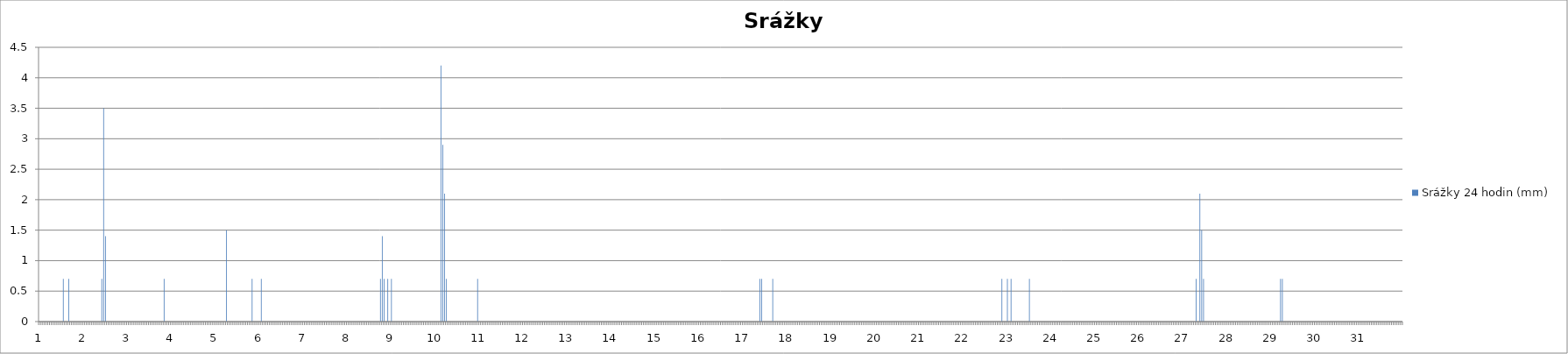
| Category | Srážky 24 hodin (mm) |
|---|---|
| 0 | 0 |
| 1 | 0 |
| 2 | 0 |
| 3 | 0 |
| 4 | 0 |
| 5 | 0 |
| 6 | 0 |
| 7 | 0 |
| 8 | 0 |
| 9 | 0 |
| 10 | 0 |
| 11 | 0 |
| 12 | 0 |
| 13 | 0.7 |
| 14 | 0 |
| 15 | 0 |
| 16 | 0.7 |
| 17 | 0 |
| 18 | 0 |
| 19 | 0 |
| 20 | 0 |
| 21 | 0 |
| 22 | 0 |
| 23 | 0 |
| 24 | 0 |
| 25 | 0 |
| 26 | 0 |
| 27 | 0 |
| 28 | 0 |
| 29 | 0 |
| 30 | 0 |
| 31 | 0 |
| 32 | 0 |
| 33 | 0 |
| 34 | 0.7 |
| 35 | 3.5 |
| 36 | 1.4 |
| 37 | 0 |
| 38 | 0 |
| 39 | 0 |
| 40 | 0 |
| 41 | 0 |
| 42 | 0 |
| 43 | 0 |
| 44 | 0 |
| 45 | 0 |
| 46 | 0 |
| 47 | 0 |
| 48 | 0 |
| 49 | 0 |
| 50 | 0 |
| 51 | 0 |
| 52 | 0 |
| 53 | 0 |
| 54 | 0 |
| 55 | 0 |
| 56 | 0 |
| 57 | 0 |
| 58 | 0 |
| 59 | 0 |
| 60 | 0 |
| 61 | 0 |
| 62 | 0 |
| 63 | 0 |
| 64 | 0 |
| 65 | 0 |
| 66 | 0 |
| 67 | 0 |
| 68 | 0.7 |
| 69 | 0 |
| 70 | 0 |
| 71 | 0 |
| 72 | 0 |
| 73 | 0 |
| 74 | 0 |
| 75 | 0 |
| 76 | 0 |
| 77 | 0 |
| 78 | 0 |
| 79 | 0 |
| 80 | 0 |
| 81 | 0 |
| 82 | 0 |
| 83 | 0 |
| 84 | 0 |
| 85 | 0 |
| 86 | 0 |
| 87 | 0 |
| 88 | 0 |
| 89 | 0 |
| 90 | 0 |
| 91 | 0 |
| 92 | 0 |
| 93 | 0 |
| 94 | 0 |
| 95 | 0 |
| 96 | 0 |
| 97 | 0 |
| 98 | 0 |
| 99 | 0 |
| 100 | 0 |
| 101 | 0 |
| 102 | 1.5 |
| 103 | 0 |
| 104 | 0 |
| 105 | 0 |
| 106 | 0 |
| 107 | 0 |
| 108 | 0 |
| 109 | 0 |
| 110 | 0 |
| 111 | 0 |
| 112 | 0 |
| 113 | 0 |
| 114 | 0 |
| 115 | 0 |
| 116 | 0.7 |
| 117 | 0 |
| 118 | 0 |
| 119 | 0 |
| 120 | 0 |
| 121 | 0.7 |
| 122 | 0 |
| 123 | 0 |
| 124 | 0 |
| 125 | 0 |
| 126 | 0 |
| 127 | 0 |
| 128 | 0 |
| 129 | 0 |
| 130 | 0 |
| 131 | 0 |
| 132 | 0 |
| 133 | 0 |
| 134 | 0 |
| 135 | 0 |
| 136 | 0 |
| 137 | 0 |
| 138 | 0 |
| 139 | 0 |
| 140 | 0 |
| 141 | 0 |
| 142 | 0 |
| 143 | 0 |
| 144 | 0 |
| 145 | 0 |
| 146 | 0 |
| 147 | 0 |
| 148 | 0 |
| 149 | 0 |
| 150 | 0 |
| 151 | 0 |
| 152 | 0 |
| 153 | 0 |
| 154 | 0 |
| 155 | 0 |
| 156 | 0 |
| 157 | 0 |
| 158 | 0 |
| 159 | 0 |
| 160 | 0 |
| 161 | 0 |
| 162 | 0 |
| 163 | 0 |
| 164 | 0 |
| 165 | 0 |
| 166 | 0 |
| 167 | 0 |
| 168 | 0 |
| 169 | 0 |
| 170 | 0 |
| 171 | 0 |
| 172 | 0 |
| 173 | 0 |
| 174 | 0 |
| 175 | 0 |
| 176 | 0 |
| 177 | 0 |
| 178 | 0 |
| 179 | 0 |
| 180 | 0 |
| 181 | 0 |
| 182 | 0 |
| 183 | 0 |
| 184 | 0 |
| 185 | 0 |
| 186 | 0.7 |
| 187 | 1.4 |
| 188 | 0.7 |
| 189 | 0 |
| 190 | 0.7 |
| 191 | 0 |
| 192 | 0.7 |
| 193 | 0 |
| 194 | 0 |
| 195 | 0 |
| 196 | 0 |
| 197 | 0 |
| 198 | 0 |
| 199 | 0 |
| 200 | 0 |
| 201 | 0 |
| 202 | 0 |
| 203 | 0 |
| 204 | 0 |
| 205 | 0 |
| 206 | 0 |
| 207 | 0 |
| 208 | 0 |
| 209 | 0 |
| 210 | 0 |
| 211 | 0 |
| 212 | 0 |
| 213 | 0 |
| 214 | 0 |
| 215 | 0 |
| 216 | 0 |
| 217 | 0 |
| 218 | 0 |
| 219 | 4.2 |
| 220 | 2.9 |
| 221 | 2.1 |
| 222 | 0.7 |
| 223 | 0 |
| 224 | 0 |
| 225 | 0 |
| 226 | 0 |
| 227 | 0 |
| 228 | 0 |
| 229 | 0 |
| 230 | 0 |
| 231 | 0 |
| 232 | 0 |
| 233 | 0 |
| 234 | 0 |
| 235 | 0 |
| 236 | 0 |
| 237 | 0 |
| 238 | 0 |
| 239 | 0.7 |
| 240 | 0 |
| 241 | 0 |
| 242 | 0 |
| 243 | 0 |
| 244 | 0 |
| 245 | 0 |
| 246 | 0 |
| 247 | 0 |
| 248 | 0 |
| 249 | 0 |
| 250 | 0 |
| 251 | 0 |
| 252 | 0 |
| 253 | 0 |
| 254 | 0 |
| 255 | 0 |
| 256 | 0 |
| 257 | 0 |
| 258 | 0 |
| 259 | 0 |
| 260 | 0 |
| 261 | 0 |
| 262 | 0 |
| 263 | 0 |
| 264 | 0 |
| 265 | 0 |
| 266 | 0 |
| 267 | 0 |
| 268 | 0 |
| 269 | 0 |
| 270 | 0 |
| 271 | 0 |
| 272 | 0 |
| 273 | 0 |
| 274 | 0 |
| 275 | 0 |
| 276 | 0 |
| 277 | 0 |
| 278 | 0 |
| 279 | 0 |
| 280 | 0 |
| 281 | 0 |
| 282 | 0 |
| 283 | 0 |
| 284 | 0 |
| 285 | 0 |
| 286 | 0 |
| 287 | 0 |
| 288 | 0 |
| 289 | 0 |
| 290 | 0 |
| 291 | 0 |
| 292 | 0 |
| 293 | 0 |
| 294 | 0 |
| 295 | 0 |
| 296 | 0 |
| 297 | 0 |
| 298 | 0 |
| 299 | 0 |
| 300 | 0 |
| 301 | 0 |
| 302 | 0 |
| 303 | 0 |
| 304 | 0 |
| 305 | 0 |
| 306 | 0 |
| 307 | 0 |
| 308 | 0 |
| 309 | 0 |
| 310 | 0 |
| 311 | 0 |
| 312 | 0 |
| 313 | 0 |
| 314 | 0 |
| 315 | 0 |
| 316 | 0 |
| 317 | 0 |
| 318 | 0 |
| 319 | 0 |
| 320 | 0 |
| 321 | 0 |
| 322 | 0 |
| 323 | 0 |
| 324 | 0 |
| 325 | 0 |
| 326 | 0 |
| 327 | 0 |
| 328 | 0 |
| 329 | 0 |
| 330 | 0 |
| 331 | 0 |
| 332 | 0 |
| 333 | 0 |
| 334 | 0 |
| 335 | 0 |
| 336 | 0 |
| 337 | 0 |
| 338 | 0 |
| 339 | 0 |
| 340 | 0 |
| 341 | 0 |
| 342 | 0 |
| 343 | 0 |
| 344 | 0 |
| 345 | 0 |
| 346 | 0 |
| 347 | 0 |
| 348 | 0 |
| 349 | 0 |
| 350 | 0 |
| 351 | 0 |
| 352 | 0 |
| 353 | 0 |
| 354 | 0 |
| 355 | 0 |
| 356 | 0 |
| 357 | 0 |
| 358 | 0 |
| 359 | 0 |
| 360 | 0 |
| 361 | 0 |
| 362 | 0 |
| 363 | 0 |
| 364 | 0 |
| 365 | 0 |
| 366 | 0 |
| 367 | 0 |
| 368 | 0 |
| 369 | 0 |
| 370 | 0 |
| 371 | 0 |
| 372 | 0 |
| 373 | 0 |
| 374 | 0 |
| 375 | 0 |
| 376 | 0 |
| 377 | 0 |
| 378 | 0 |
| 379 | 0 |
| 380 | 0 |
| 381 | 0 |
| 382 | 0 |
| 383 | 0 |
| 384 | 0 |
| 385 | 0 |
| 386 | 0 |
| 387 | 0 |
| 388 | 0 |
| 389 | 0 |
| 390 | 0 |
| 391 | 0 |
| 392 | 0 |
| 393 | 0.7 |
| 394 | 0.7 |
| 395 | 0 |
| 396 | 0 |
| 397 | 0 |
| 398 | 0 |
| 399 | 0 |
| 400 | 0.7 |
| 401 | 0 |
| 402 | 0 |
| 403 | 0 |
| 404 | 0 |
| 405 | 0 |
| 406 | 0 |
| 407 | 0 |
| 408 | 0 |
| 409 | 0 |
| 410 | 0 |
| 411 | 0 |
| 412 | 0 |
| 413 | 0 |
| 414 | 0 |
| 415 | 0 |
| 416 | 0 |
| 417 | 0 |
| 418 | 0 |
| 419 | 0 |
| 420 | 0 |
| 421 | 0 |
| 422 | 0 |
| 423 | 0 |
| 424 | 0 |
| 425 | 0 |
| 426 | 0 |
| 427 | 0 |
| 428 | 0 |
| 429 | 0 |
| 430 | 0 |
| 431 | 0 |
| 432 | 0 |
| 433 | 0 |
| 434 | 0 |
| 435 | 0 |
| 436 | 0 |
| 437 | 0 |
| 438 | 0 |
| 439 | 0 |
| 440 | 0 |
| 441 | 0 |
| 442 | 0 |
| 443 | 0 |
| 444 | 0 |
| 445 | 0 |
| 446 | 0 |
| 447 | 0 |
| 448 | 0 |
| 449 | 0 |
| 450 | 0 |
| 451 | 0 |
| 452 | 0 |
| 453 | 0 |
| 454 | 0 |
| 455 | 0 |
| 456 | 0 |
| 457 | 0 |
| 458 | 0 |
| 459 | 0 |
| 460 | 0 |
| 461 | 0 |
| 462 | 0 |
| 463 | 0 |
| 464 | 0 |
| 465 | 0 |
| 466 | 0 |
| 467 | 0 |
| 468 | 0 |
| 469 | 0 |
| 470 | 0 |
| 471 | 0 |
| 472 | 0 |
| 473 | 0 |
| 474 | 0 |
| 475 | 0 |
| 476 | 0 |
| 477 | 0 |
| 478 | 0 |
| 479 | 0 |
| 480 | 0 |
| 481 | 0 |
| 482 | 0 |
| 483 | 0 |
| 484 | 0 |
| 485 | 0 |
| 486 | 0 |
| 487 | 0 |
| 488 | 0 |
| 489 | 0 |
| 490 | 0 |
| 491 | 0 |
| 492 | 0 |
| 493 | 0 |
| 494 | 0 |
| 495 | 0 |
| 496 | 0 |
| 497 | 0 |
| 498 | 0 |
| 499 | 0 |
| 500 | 0 |
| 501 | 0 |
| 502 | 0 |
| 503 | 0 |
| 504 | 0 |
| 505 | 0 |
| 506 | 0 |
| 507 | 0 |
| 508 | 0 |
| 509 | 0 |
| 510 | 0 |
| 511 | 0 |
| 512 | 0 |
| 513 | 0 |
| 514 | 0 |
| 515 | 0 |
| 516 | 0 |
| 517 | 0 |
| 518 | 0 |
| 519 | 0 |
| 520 | 0 |
| 521 | 0 |
| 522 | 0 |
| 523 | 0 |
| 524 | 0 |
| 525 | 0.7 |
| 526 | 0 |
| 527 | 0 |
| 528 | 0.7 |
| 529 | 0 |
| 530 | 0.7 |
| 531 | 0 |
| 532 | 0 |
| 533 | 0 |
| 534 | 0 |
| 535 | 0 |
| 536 | 0 |
| 537 | 0 |
| 538 | 0 |
| 539 | 0 |
| 540 | 0.7 |
| 541 | 0 |
| 542 | 0 |
| 543 | 0 |
| 544 | 0 |
| 545 | 0 |
| 546 | 0 |
| 547 | 0 |
| 548 | 0 |
| 549 | 0 |
| 550 | 0 |
| 551 | 0 |
| 552 | 0 |
| 553 | 0 |
| 554 | 0 |
| 555 | 0 |
| 556 | 0 |
| 557 | 0 |
| 558 | 0 |
| 559 | 0 |
| 560 | 0 |
| 561 | 0 |
| 562 | 0 |
| 563 | 0 |
| 564 | 0 |
| 565 | 0 |
| 566 | 0 |
| 567 | 0 |
| 568 | 0 |
| 569 | 0 |
| 570 | 0 |
| 571 | 0 |
| 572 | 0 |
| 573 | 0 |
| 574 | 0 |
| 575 | 0 |
| 576 | 0 |
| 577 | 0 |
| 578 | 0 |
| 579 | 0 |
| 580 | 0 |
| 581 | 0 |
| 582 | 0 |
| 583 | 0 |
| 584 | 0 |
| 585 | 0 |
| 586 | 0 |
| 587 | 0 |
| 588 | 0 |
| 589 | 0 |
| 590 | 0 |
| 591 | 0 |
| 592 | 0 |
| 593 | 0 |
| 594 | 0 |
| 595 | 0 |
| 596 | 0 |
| 597 | 0 |
| 598 | 0 |
| 599 | 0 |
| 600 | 0 |
| 601 | 0 |
| 602 | 0 |
| 603 | 0 |
| 604 | 0 |
| 605 | 0 |
| 606 | 0 |
| 607 | 0 |
| 608 | 0 |
| 609 | 0 |
| 610 | 0 |
| 611 | 0 |
| 612 | 0 |
| 613 | 0 |
| 614 | 0 |
| 615 | 0 |
| 616 | 0 |
| 617 | 0 |
| 618 | 0 |
| 619 | 0 |
| 620 | 0 |
| 621 | 0 |
| 622 | 0 |
| 623 | 0 |
| 624 | 0 |
| 625 | 0 |
| 626 | 0 |
| 627 | 0 |
| 628 | 0 |
| 629 | 0 |
| 630 | 0 |
| 631 | 0.7 |
| 632 | 0 |
| 633 | 2.1 |
| 634 | 1.5 |
| 635 | 0.7 |
| 636 | 0 |
| 637 | 0 |
| 638 | 0 |
| 639 | 0 |
| 640 | 0 |
| 641 | 0 |
| 642 | 0 |
| 643 | 0 |
| 644 | 0 |
| 645 | 0 |
| 646 | 0 |
| 647 | 0 |
| 648 | 0 |
| 649 | 0 |
| 650 | 0 |
| 651 | 0 |
| 652 | 0 |
| 653 | 0 |
| 654 | 0 |
| 655 | 0 |
| 656 | 0 |
| 657 | 0 |
| 658 | 0 |
| 659 | 0 |
| 660 | 0 |
| 661 | 0 |
| 662 | 0 |
| 663 | 0 |
| 664 | 0 |
| 665 | 0 |
| 666 | 0 |
| 667 | 0 |
| 668 | 0 |
| 669 | 0 |
| 670 | 0 |
| 671 | 0 |
| 672 | 0 |
| 673 | 0 |
| 674 | 0 |
| 675 | 0 |
| 676 | 0 |
| 677 | 0.7 |
| 678 | 0.7 |
| 679 | 0 |
| 680 | 0 |
| 681 | 0 |
| 682 | 0 |
| 683 | 0 |
| 684 | 0 |
| 685 | 0 |
| 686 | 0 |
| 687 | 0 |
| 688 | 0 |
| 689 | 0 |
| 690 | 0 |
| 691 | 0 |
| 692 | 0 |
| 693 | 0 |
| 694 | 0 |
| 695 | 0 |
| 696 | 0 |
| 697 | 0 |
| 698 | 0 |
| 699 | 0 |
| 700 | 0 |
| 701 | 0 |
| 702 | 0 |
| 703 | 0 |
| 704 | 0 |
| 705 | 0 |
| 706 | 0 |
| 707 | 0 |
| 708 | 0 |
| 709 | 0 |
| 710 | 0 |
| 711 | 0 |
| 712 | 0 |
| 713 | 0 |
| 714 | 0 |
| 715 | 0 |
| 716 | 0 |
| 717 | 0 |
| 718 | 0 |
| 719 | 0 |
| 720 | 0 |
| 721 | 0 |
| 722 | 0 |
| 723 | 0 |
| 724 | 0 |
| 725 | 0 |
| 726 | 0 |
| 727 | 0 |
| 728 | 0 |
| 729 | 0 |
| 730 | 0 |
| 731 | 0 |
| 732 | 0 |
| 733 | 0 |
| 734 | 0 |
| 735 | 0 |
| 736 | 0 |
| 737 | 0 |
| 738 | 0 |
| 739 | 0 |
| 740 | 0 |
| 741 | 0 |
| 742 | 0 |
| 743 | 0 |